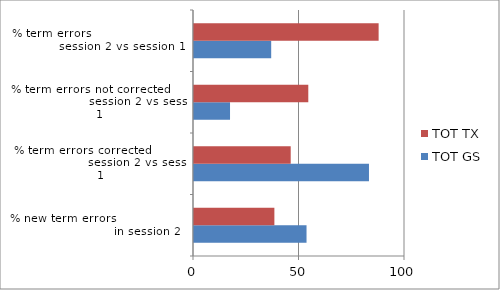
| Category | TOT GS | TOT TX |
|---|---|---|
| % new term errors                                            in session 2 | 53.333 | 38.095 |
| % term errors corrected                                session 2 vs session 1 | 82.927 | 45.833 |
| % term errors not corrected                            session 2 vs session 1 | 17.073 | 54.167 |
| % term errors                                       session 2 vs session 1 | 36.585 | 87.5 |